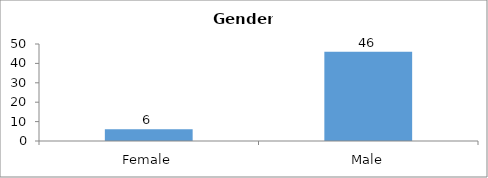
| Category | Gender |
|---|---|
| Female | 6 |
| Male | 46 |